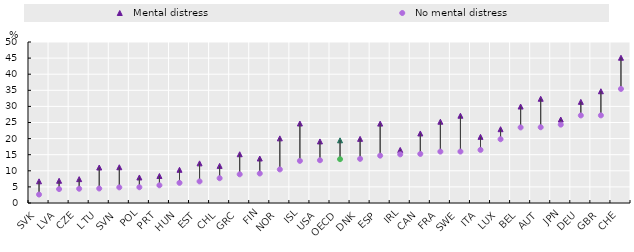
| Category |   Mental distress |   No mental distress |
|---|---|---|
| SVK | 6.734 | 2.629 |
| LVA | 6.903 | 4.331 |
| CZE | 7.413 | 4.431 |
| LTU | 11.024 | 4.505 |
| SVN | 11.106 | 4.856 |
| POL | 7.929 | 4.896 |
| PRT | 8.383 | 5.494 |
| HUN | 10.311 | 6.268 |
| EST | 12.311 | 6.706 |
| CHL | 11.522 | 7.695 |
| GRC | 15.144 | 8.913 |
| FIN | 13.816 | 9.16 |
| NOR | 20.072 | 10.424 |
| ISL | 24.685 | 13.083 |
| USA | 19.122 | 13.285 |
| OECD | 19.462 | 13.616 |
| DNK | 19.919 | 13.709 |
| ESP | 24.657 | 14.704 |
| IRL | 16.475 | 15.11 |
| CAN | 21.595 | 15.24 |
| FRA | 25.244 | 15.958 |
| SWE | 27.102 | 15.972 |
| ITA | 20.538 | 16.494 |
| LUX | 22.921 | 19.807 |
| BEL | 29.956 | 23.473 |
| AUT | 32.368 | 23.529 |
| JPN | 25.92 | 24.34 |
| DEU | 31.409 | 27.197 |
| GBR | 34.704 | 27.217 |
| CHE | 45.117 | 35.428 |